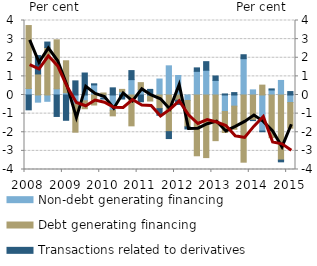
| Category | Non-debt generating financing | Debt generating financing | Transactions related to derivatives |
|---|---|---|---|
| 2008.0 | 0.348 | 3.381 | -0.797 |
| 2008.0 | -0.385 | 1.131 | 0.986 |
| 2008.0 | -0.338 | 2.551 | 0.292 |
| 2008.0 | 0.334 | 2.628 | -1.152 |
| 2009.0 | 0.125 | 1.714 | -1.358 |
| 2009.0 | -0.495 | -1.502 | 0.758 |
| 2009.0 | -0.31 | -0.426 | 1.181 |
| 2009.0 | 0.54 | -0.537 | 0.06 |
| 2010.0 | -0.188 | 0.108 | -0.028 |
| 2010.0 | -0.819 | -0.301 | 0.384 |
| 2010.0 | 0.167 | 0.134 | -0.216 |
| 2010.0 | 0.825 | -1.656 | 0.485 |
| 2011.0 | 0.28 | 0.384 | -0.362 |
| 2011.0 | -0.045 | -0.279 | 0.301 |
| 2011.0 | 0.858 | -0.734 | -0.355 |
| 2011.0 | 1.566 | -1.967 | -0.372 |
| 2012.0 | 1.048 | -0.279 | -0.228 |
| 2012.0 | -0.293 | -1.418 | -0.112 |
| 2012.0 | 1.271 | -3.263 | 0.185 |
| 2012.0 | 1.329 | -3.361 | 0.461 |
| 2013.0 | 0.783 | -2.451 | 0.238 |
| 2013.0 | -0.888 | -1.127 | 0.057 |
| 2013.0 | -0.599 | -1.241 | 0.129 |
| 2013.0 | 1.95 | -3.607 | 0.212 |
| 2014.0 | 0.275 | -1.358 | -0.017 |
| 2014.0 | -1.937 | 0.53 | -0.035 |
| 2014.0 | 0.27 | -2.289 | 0.058 |
| 2014.0 | 0.781 | -3.496 | -0.093 |
| 2015.0 | -0.404 | -1.379 | 0.184 |